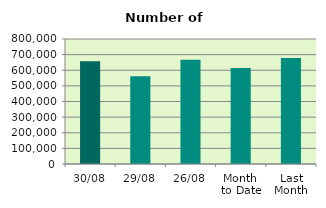
| Category | Series 0 |
|---|---|
| 30/08 | 657734 |
| 29/08 | 561356 |
| 26/08 | 666960 |
| Month 
to Date | 615138.455 |
| Last
Month | 677996.667 |